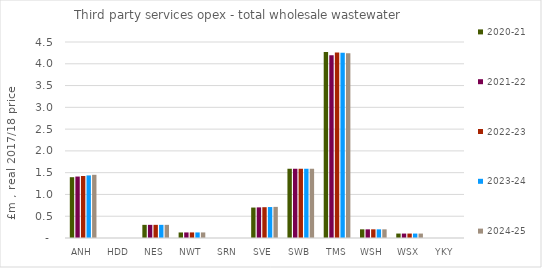
| Category | 2020-21 | 2021-22 | 2022-23 | 2023-24 | 2024-25 |
|---|---|---|---|---|---|
| ANH | 1.396 | 1.411 | 1.423 | 1.437 | 1.451 |
| HDD | 0 | 0 | 0 | 0 | 0 |
| NES | 0.302 | 0.302 | 0.302 | 0.302 | 0.302 |
| NWT | 0.127 | 0.128 | 0.128 | 0.128 | 0.128 |
| SRN | 0 | 0 | 0 | 0 | 0 |
| SVE | 0.699 | 0.703 | 0.707 | 0.711 | 0.715 |
| SWB | 1.59 | 1.59 | 1.59 | 1.59 | 1.59 |
| TMS | 4.268 | 4.195 | 4.258 | 4.256 | 4.24 |
| WSH | 0.199 | 0.199 | 0.199 | 0.199 | 0.199 |
| WSX | 0.102 | 0.102 | 0.102 | 0.102 | 0.102 |
| YKY | 0 | 0 | 0 | 0 | 0 |